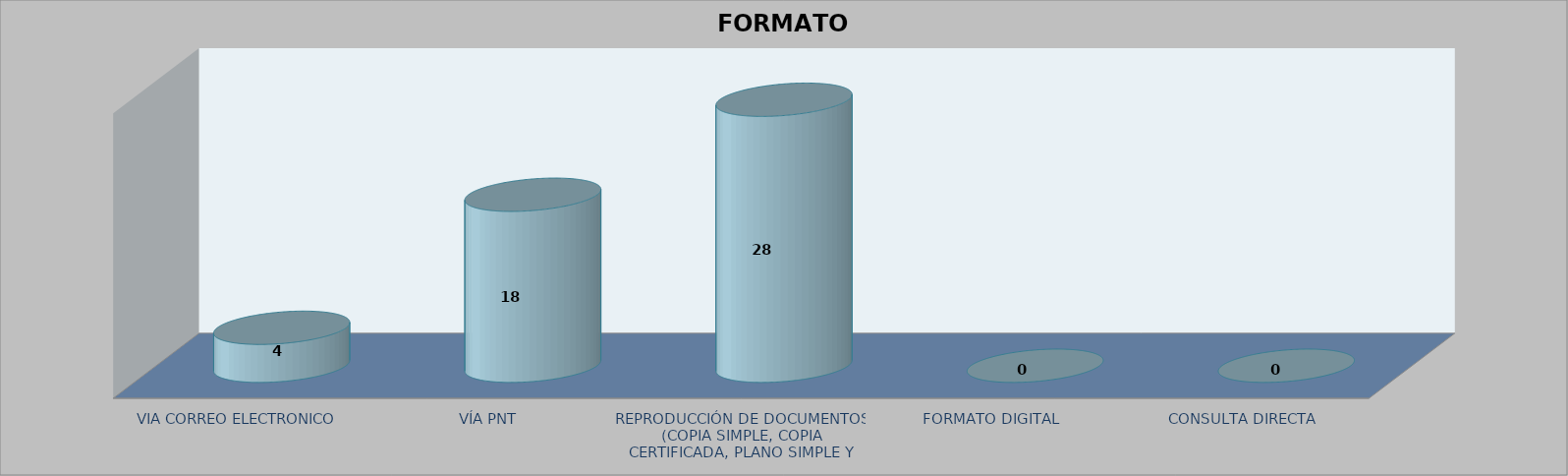
| Category |        FORMATO SOLICITADO | Series 1 | Series 2 |
|---|---|---|---|
| VIA CORREO ELECTRONICO |  |  | 4 |
| VÍA PNT |  |  | 18 |
| REPRODUCCIÓN DE DOCUMENTOS (COPIA SIMPLE, COPIA CERTIFICADA, PLANO SIMPLE Y PLANO CERTIFICADO) |  |  | 28 |
| FORMATO DIGITAL |  |  | 0 |
| CONSULTA DIRECTA |  |  | 0 |